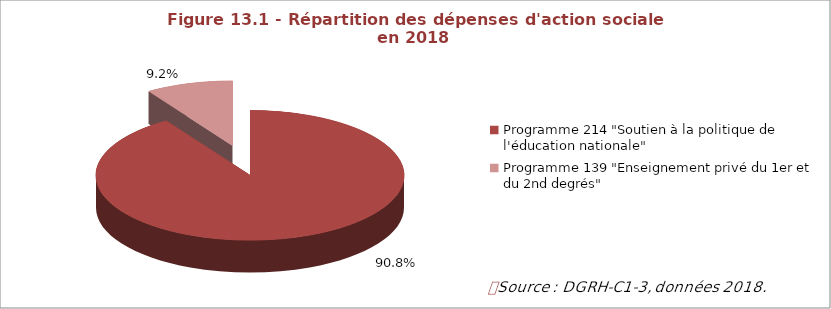
| Category | Figure 10.1 - Répartition des dépenses d'action sociale en 2015 par programme LOLF (214 et 139) |
|---|---|
| Programme 214 "Soutien à la politique de l'éducation nationale" | 0.908 |
| Programme 139 "Enseignement privé du 1er et du 2nd degrés" | 0.092 |